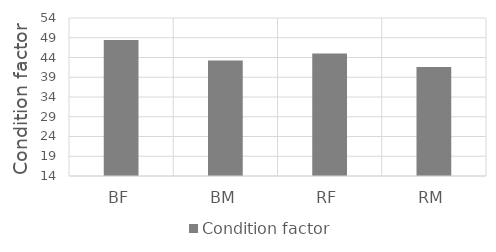
| Category | Condition factor |
|---|---|
| BF | 48.442 |
| BM | 43.244 |
| RF | 45.019 |
| RM | 41.581 |